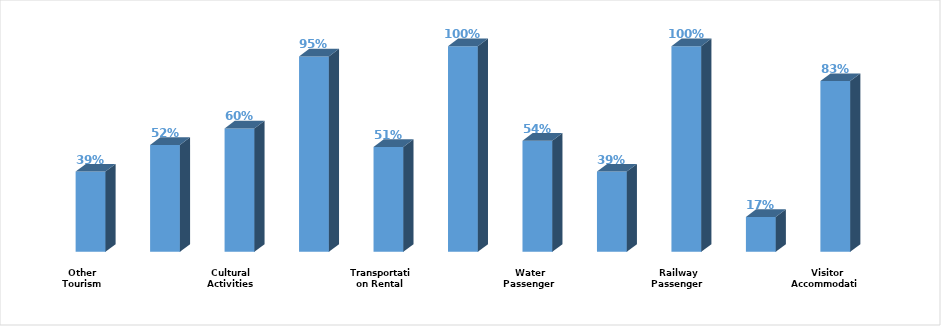
| Category | Series 0 |
|---|---|
|  Visitor Accommodation | 0.83 |
| Food and Beverage | 0.17 |
|  Railway Passenger Transport | 1 |
|  Land Passenger Transport | 0.39 |
|  Water Passenger Transport | 0.54 |
|  Air Passenger Transport | 1 |
|  Transportation Rental | 0.51 |
|   Travel Agencies and Reservation Services | 0.95 |
| Cultural Activities | 0.6 |
| Sports and Recreational Activities | 0.52 |
| Other Tourism Characteristic Services  | 0.39 |